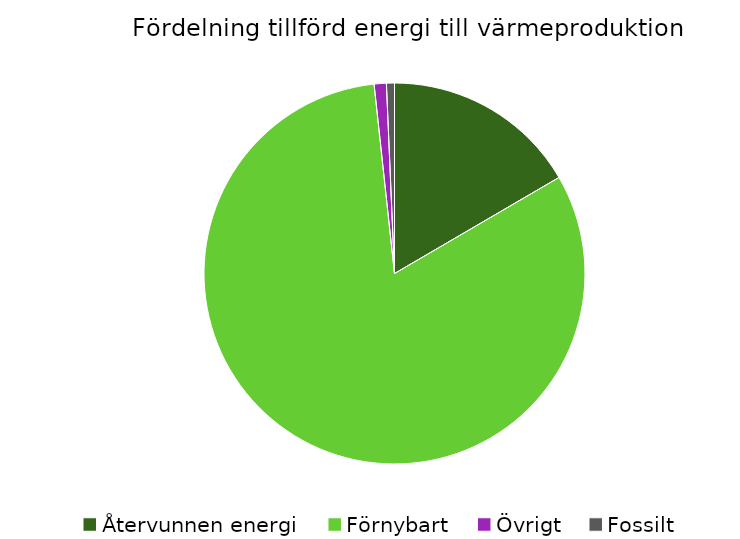
| Category | Fördelning värmeproduktion |
|---|---|
| Återvunnen energi | 0.166 |
| Förnybart | 0.817 |
| Övrigt | 0.01 |
| Fossilt | 0.007 |